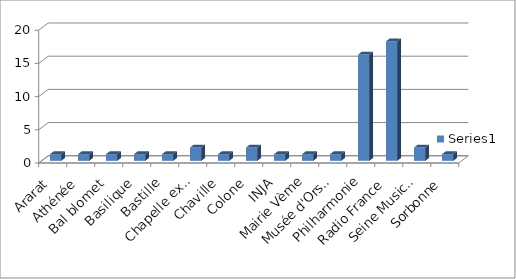
| Category | Series 0 |
|---|---|
| Ararat | 1 |
| Athénée | 1 |
| Bal blomet | 1 |
| Basilique | 1 |
| Bastille | 1 |
| Chapelle expiatoire | 2 |
| Chaville | 1 |
| Colone | 2 |
| INJA | 1 |
| Mairie Vème | 1 |
| Musée d'Orsay | 1 |
| Philharmonie | 16 |
| Radio France | 18 |
| Seine Musicale | 2 |
| Sorbonne | 1 |